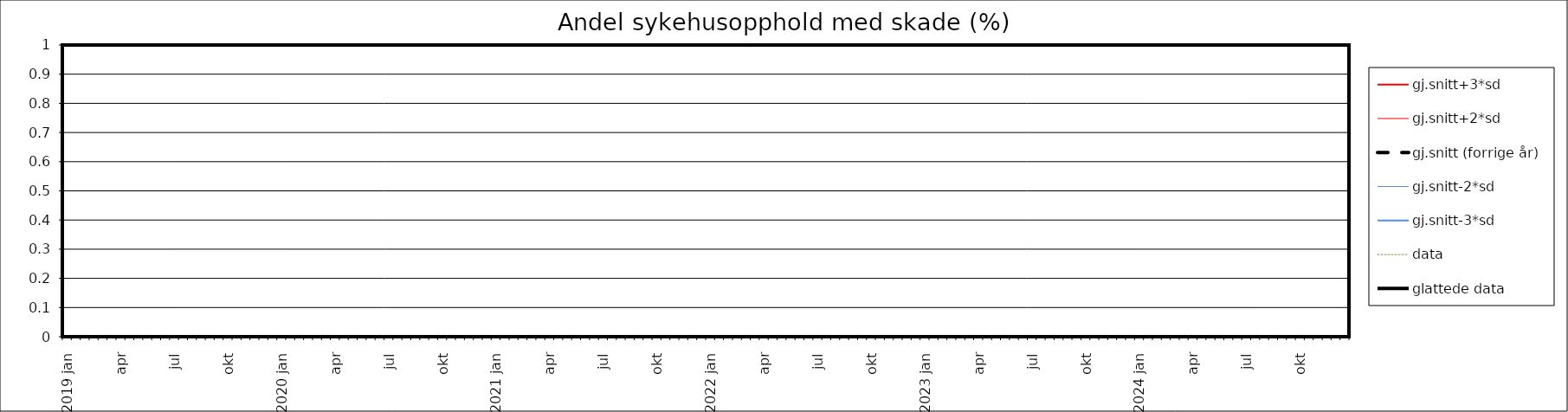
| Category | gj.snitt+3*sd | gj.snitt+2*sd | gj.snitt (forrige år) | gj.snitt-2*sd | gj.snitt-3*sd | data | glattede data |
|---|---|---|---|---|---|---|---|
| 2019 jan | 0 | 0 | 0 | 0 | 0 | 0 | 0 |
|  | 0 | 0 | 0 | 0 | 0 | 0 | 0 |
| feb | 0 | 0 | 0 | 0 | 0 | 0 | 0 |
|  | 0 | 0 | 0 | 0 | 0 | 0 | 0 |
| mar | 0 | 0 | 0 | 0 | 0 | 0 | 0 |
|  | 0 | 0 | 0 | 0 | 0 | 0 | 0 |
| apr | 0 | 0 | 0 | 0 | 0 | 0 | 0 |
|  | 0 | 0 | 0 | 0 | 0 | 0 | 0 |
| mai | 0 | 0 | 0 | 0 | 0 | 0 | 0 |
|  | 0 | 0 | 0 | 0 | 0 | 0 | 0 |
| jun | 0 | 0 | 0 | 0 | 0 | 0 | 0 |
|  | 0 | 0 | 0 | 0 | 0 | 0 | 0 |
| jul | 0 | 0 | 0 | 0 | 0 | 0 | 0 |
|  | 0 | 0 | 0 | 0 | 0 | 0 | 0 |
| aug | 0 | 0 | 0 | 0 | 0 | 0 | 0 |
|  | 0 | 0 | 0 | 0 | 0 | 0 | 0 |
| sep | 0 | 0 | 0 | 0 | 0 | 0 | 0 |
|  | 0 | 0 | 0 | 0 | 0 | 0 | 0 |
| okt | 0 | 0 | 0 | 0 | 0 | 0 | 0 |
|  | 0 | 0 | 0 | 0 | 0 | 0 | 0 |
| nov | 0 | 0 | 0 | 0 | 0 | 0 | 0 |
|  | 0 | 0 | 0 | 0 | 0 | 0 | 0 |
| des | 0 | 0 | 0 | 0 | 0 | 0 | 0 |
|  | 0 | 0 | 0 | 0 | 0 | 0 | 0 |
| 2020 jan | 0 | 0 | 0 | 0 | 0 | 0 | 0 |
|  | 0 | 0 | 0 | 0 | 0 | 0 | 0 |
| feb | 0 | 0 | 0 | 0 | 0 | 0 | 0 |
|  | 0 | 0 | 0 | 0 | 0 | 0 | 0 |
| mar | 0 | 0 | 0 | 0 | 0 | 0 | 0 |
|  | 0 | 0 | 0 | 0 | 0 | 0 | 0 |
| apr | 0 | 0 | 0 | 0 | 0 | 0 | 0 |
|  | 0 | 0 | 0 | 0 | 0 | 0 | 0 |
| mai | 0 | 0 | 0 | 0 | 0 | 0 | 0 |
|  | 0 | 0 | 0 | 0 | 0 | 0 | 0 |
| jun | 0 | 0 | 0 | 0 | 0 | 0 | 0 |
|  | 0 | 0 | 0 | 0 | 0 | 0 | 0 |
| jul | 0 | 0 | 0 | 0 | 0 | 0 | 0 |
|  | 0 | 0 | 0 | 0 | 0 | 0 | 0 |
| aug | 0 | 0 | 0 | 0 | 0 | 0 | 0 |
|  | 0 | 0 | 0 | 0 | 0 | 0 | 0 |
| sep | 0 | 0 | 0 | 0 | 0 | 0 | 0 |
|  | 0 | 0 | 0 | 0 | 0 | 0 | 0 |
| okt | 0 | 0 | 0 | 0 | 0 | 0 | 0 |
|  | 0 | 0 | 0 | 0 | 0 | 0 | 0 |
| nov | 0 | 0 | 0 | 0 | 0 | 0 | 0 |
|  | 0 | 0 | 0 | 0 | 0 | 0 | 0 |
| des | 0 | 0 | 0 | 0 | 0 | 0 | 0 |
|  | 0 | 0 | 0 | 0 | 0 | 0 | 0 |
| 2021 jan | 0 | 0 | 0 | 0 | 0 | 0 | 0 |
|  | 0 | 0 | 0 | 0 | 0 | 0 | 0 |
| feb | 0 | 0 | 0 | 0 | 0 | 0 | 0 |
|  | 0 | 0 | 0 | 0 | 0 | 0 | 0 |
| mar | 0 | 0 | 0 | 0 | 0 | 0 | 0 |
|  | 0 | 0 | 0 | 0 | 0 | 0 | 0 |
| apr | 0 | 0 | 0 | 0 | 0 | 0 | 0 |
|  | 0 | 0 | 0 | 0 | 0 | 0 | 0 |
| mai | 0 | 0 | 0 | 0 | 0 | 0 | 0 |
|  | 0 | 0 | 0 | 0 | 0 | 0 | 0 |
| jun | 0 | 0 | 0 | 0 | 0 | 0 | 0 |
|  | 0 | 0 | 0 | 0 | 0 | 0 | 0 |
| jul | 0 | 0 | 0 | 0 | 0 | 0 | 0 |
|  | 0 | 0 | 0 | 0 | 0 | 0 | 0 |
| aug | 0 | 0 | 0 | 0 | 0 | 0 | 0 |
|  | 0 | 0 | 0 | 0 | 0 | 0 | 0 |
| sep | 0 | 0 | 0 | 0 | 0 | 0 | 0 |
|  | 0 | 0 | 0 | 0 | 0 | 0 | 0 |
| okt | 0 | 0 | 0 | 0 | 0 | 0 | 0 |
|  | 0 | 0 | 0 | 0 | 0 | 0 | 0 |
| nov | 0 | 0 | 0 | 0 | 0 | 0 | 0 |
|  | 0 | 0 | 0 | 0 | 0 | 0 | 0 |
| des | 0 | 0 | 0 | 0 | 0 | 0 | 0 |
|  | 0 | 0 | 0 | 0 | 0 | 0 | 0 |
| 2022 jan | 0 | 0 | 0 | 0 | 0 | 0 | 0 |
|  | 0 | 0 | 0 | 0 | 0 | 0 | 0 |
| feb | 0 | 0 | 0 | 0 | 0 | 0 | 0 |
|  | 0 | 0 | 0 | 0 | 0 | 0 | 0 |
| mar | 0 | 0 | 0 | 0 | 0 | 0 | 0 |
|  | 0 | 0 | 0 | 0 | 0 | 0 | 0 |
| apr | 0 | 0 | 0 | 0 | 0 | 0 | 0 |
|  | 0 | 0 | 0 | 0 | 0 | 0 | 0 |
| mai | 0 | 0 | 0 | 0 | 0 | 0 | 0 |
|  | 0 | 0 | 0 | 0 | 0 | 0 | 0 |
| jun | 0 | 0 | 0 | 0 | 0 | 0 | 0 |
|  | 0 | 0 | 0 | 0 | 0 | 0 | 0 |
| jul | 0 | 0 | 0 | 0 | 0 | 0 | 0 |
|  | 0 | 0 | 0 | 0 | 0 | 0 | 0 |
| aug | 0 | 0 | 0 | 0 | 0 | 0 | 0 |
|  | 0 | 0 | 0 | 0 | 0 | 0 | 0 |
| sep | 0 | 0 | 0 | 0 | 0 | 0 | 0 |
|  | 0 | 0 | 0 | 0 | 0 | 0 | 0 |
| okt | 0 | 0 | 0 | 0 | 0 | 0 | 0 |
|  | 0 | 0 | 0 | 0 | 0 | 0 | 0 |
| nov | 0 | 0 | 0 | 0 | 0 | 0 | 0 |
|  | 0 | 0 | 0 | 0 | 0 | 0 | 0 |
| des | 0 | 0 | 0 | 0 | 0 | 0 | 0 |
|  | 0 | 0 | 0 | 0 | 0 | 0 | 0 |
| 2023 jan | 0 | 0 | 0 | 0 | 0 | 0 | 0 |
|  | 0 | 0 | 0 | 0 | 0 | 0 | 0 |
| feb | 0 | 0 | 0 | 0 | 0 | 0 | 0 |
|  | 0 | 0 | 0 | 0 | 0 | 0 | 0 |
| mar | 0 | 0 | 0 | 0 | 0 | 0 | 0 |
|  | 0 | 0 | 0 | 0 | 0 | 0 | 0 |
| apr | 0 | 0 | 0 | 0 | 0 | 0 | 0 |
|  | 0 | 0 | 0 | 0 | 0 | 0 | 0 |
| mai | 0 | 0 | 0 | 0 | 0 | 0 | 0 |
|  | 0 | 0 | 0 | 0 | 0 | 0 | 0 |
| jun | 0 | 0 | 0 | 0 | 0 | 0 | 0 |
|  | 0 | 0 | 0 | 0 | 0 | 0 | 0 |
| jul | 0 | 0 | 0 | 0 | 0 | 0 | 0 |
|  | 0 | 0 | 0 | 0 | 0 | 0 | 0 |
| aug | 0 | 0 | 0 | 0 | 0 | 0 | 0 |
|  | 0 | 0 | 0 | 0 | 0 | 0 | 0 |
| sep | 0 | 0 | 0 | 0 | 0 | 0 | 0 |
|  | 0 | 0 | 0 | 0 | 0 | 0 | 0 |
| okt | 0 | 0 | 0 | 0 | 0 | 0 | 0 |
|  | 0 | 0 | 0 | 0 | 0 | 0 | 0 |
| nov | 0 | 0 | 0 | 0 | 0 | 0 | 0 |
|  | 0 | 0 | 0 | 0 | 0 | 0 | 0 |
| des | 0 | 0 | 0 | 0 | 0 | 0 | 0 |
|  | 0 | 0 | 0 | 0 | 0 | 0 | 0 |
| 2024 jan | 0 | 0 | 0 | 0 | 0 | 0 | 0 |
|  | 0 | 0 | 0 | 0 | 0 | 0 | 0 |
| feb | 0 | 0 | 0 | 0 | 0 | 0 | 0 |
|  | 0 | 0 | 0 | 0 | 0 | 0 | 0 |
| mar | 0 | 0 | 0 | 0 | 0 | 0 | 0 |
|  | 0 | 0 | 0 | 0 | 0 | 0 | 0 |
| apr | 0 | 0 | 0 | 0 | 0 | 0 | 0 |
|  | 0 | 0 | 0 | 0 | 0 | 0 | 0 |
| mai | 0 | 0 | 0 | 0 | 0 | 0 | 0 |
|  | 0 | 0 | 0 | 0 | 0 | 0 | 0 |
| jun | 0 | 0 | 0 | 0 | 0 | 0 | 0 |
|  | 0 | 0 | 0 | 0 | 0 | 0 | 0 |
| jul | 0 | 0 | 0 | 0 | 0 | 0 | 0 |
|  | 0 | 0 | 0 | 0 | 0 | 0 | 0 |
| aug | 0 | 0 | 0 | 0 | 0 | 0 | 0 |
|  | 0 | 0 | 0 | 0 | 0 | 0 | 0 |
| sep | 0 | 0 | 0 | 0 | 0 | 0 | 0 |
|  | 0 | 0 | 0 | 0 | 0 | 0 | 0 |
| okt | 0 | 0 | 0 | 0 | 0 | 0 | 0 |
|  | 0 | 0 | 0 | 0 | 0 | 0 | 0 |
| nov | 0 | 0 | 0 | 0 | 0 | 0 | 0 |
|  | 0 | 0 | 0 | 0 | 0 | 0 | 0 |
| des | 0 | 0 | 0 | 0 | 0 | 0 | 0 |